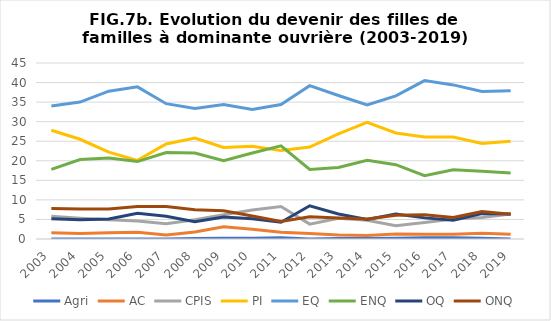
| Category | Agri | AC | CPIS | PI | EQ | ENQ | OQ | ONQ |
|---|---|---|---|---|---|---|---|---|
| 2003.0 | 0 | 1.6 | 5.8 | 27.8 | 34 | 17.8 | 5.2 | 7.8 |
| 2004.0 | 0 | 1.4 | 5.3 | 25.5 | 35 | 20.3 | 4.9 | 7.7 |
| 2005.0 | 0 | 1.6 | 4.9 | 22.2 | 37.8 | 20.7 | 5.1 | 7.7 |
| 2006.0 | 0 | 1.7 | 4.6 | 20.1 | 38.9 | 19.8 | 6.6 | 8.3 |
| 2007.0 | 0 | 1 | 3.9 | 24.3 | 34.6 | 22.1 | 5.8 | 8.3 |
| 2008.0 | 0.1 | 1.8 | 4.9 | 25.8 | 33.4 | 22 | 4.4 | 7.5 |
| 2009.0 | 0.2 | 3.1 | 6.2 | 23.4 | 34.4 | 20 | 5.6 | 7.2 |
| 2010.0 | 0.2 | 2.5 | 7.4 | 23.7 | 33.1 | 22 | 5.2 | 5.9 |
| 2011.0 | 0.3 | 1.7 | 8.3 | 22.6 | 34.4 | 23.8 | 4.3 | 4.5 |
| 2012.0 | 0 | 1.4 | 3.8 | 23.5 | 39.2 | 17.8 | 8.5 | 5.7 |
| 2013.0 | 0.1 | 1 | 5.3 | 26.9 | 36.7 | 18.3 | 6.4 | 5.4 |
| 2014.0 | 0.1 | 0.9 | 4.8 | 29.8 | 34.3 | 20.1 | 5 | 5.1 |
| 2015.0 | 0.2 | 1.3 | 3.4 | 27.1 | 36.6 | 19 | 6.4 | 6.1 |
| 2016.0 | 0.3 | 1.2 | 4.2 | 26.1 | 40.5 | 16.2 | 5.4 | 6.2 |
| 2017.0 | 0.3 | 1.2 | 5.1 | 26.1 | 39.4 | 17.7 | 4.8 | 5.5 |
| 2018.0 | 0.2 | 1.5 | 5.5 | 24.4 | 37.7 | 17.3 | 6.5 | 7 |
| 2019.0 | 0 | 1.2 | 6.4 | 25 | 37.9 | 16.9 | 6.4 | 6.3 |